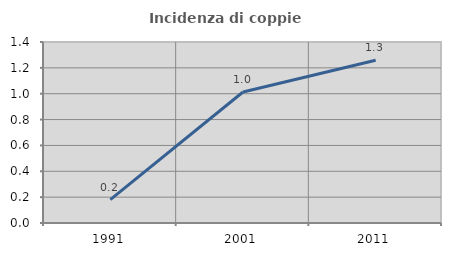
| Category | Incidenza di coppie miste |
|---|---|
| 1991.0 | 0.181 |
| 2001.0 | 1.013 |
| 2011.0 | 1.259 |